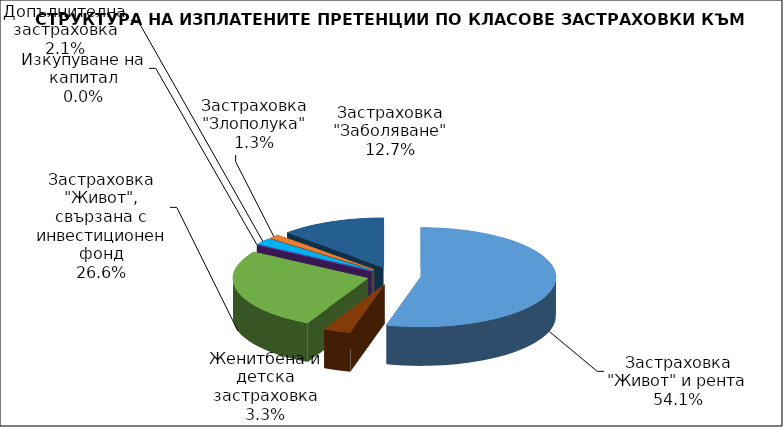
| Category | Застраховка "Живот" и рента |
|---|---|
| Застраховка "Живот" и рента | 13645664.394 |
| Женитбена и детска застраховка | 830504.226 |
| Застраховка "Живот", свързана с инвестиционен фонд | 6707292.888 |
| Изкупуване на капитал | 0 |
| Допълнителна застраховка | 533219.739 |
| Застраховка "Злополука" | 326230.69 |
| Застраховка "Заболяване" | 3193138.565 |